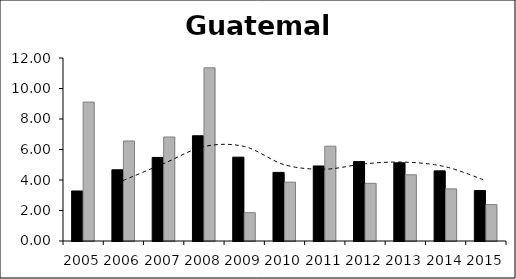
| Category | Series 0 | Series 1 |
|---|---|---|
| 2005.0 | 3.28 | 9.109 |
| 2006.0 | 4.67 | 6.561 |
| 2007.0 | 5.48 | 6.822 |
| 2008.0 | 6.9 | 11.356 |
| 2009.0 | 5.5 | 1.859 |
| 2010.0 | 4.5 | 3.86 |
| 2011.0 | 4.92 | 6.216 |
| 2012.0 | 5.21 | 3.783 |
| 2013.0 | 5.13 | 4.343 |
| 2014.0 | 4.6 | 3.418 |
| 2015.0 | 3.31 | 2.389 |